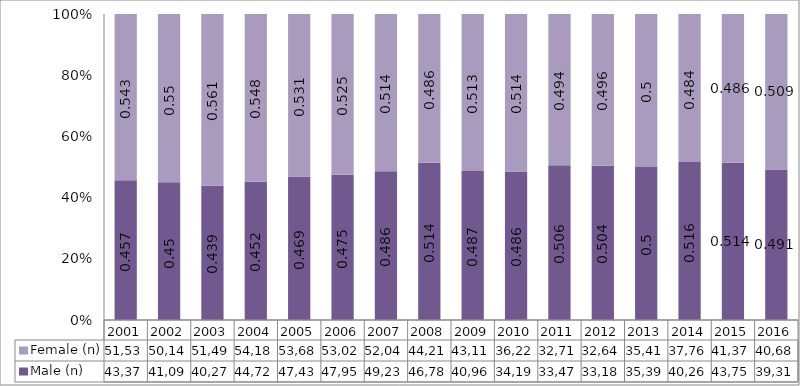
| Category | Male (n) | Female (n) |
|---|---|---|
| 2001.0 | 43374 | 51532 |
| 2002.0 | 41094 | 50146 |
| 2003.0 | 40274 | 51493 |
| 2004.0 | 44726 | 54185 |
| 2005.0 | 47438 | 53688 |
| 2006.0 | 47952 | 53025 |
| 2007.0 | 49232 | 52049 |
| 2008.0 | 46784 | 44218 |
| 2009.0 | 40960 | 43113 |
| 2010.0 | 34196 | 36223 |
| 2011.0 | 33471 | 32713 |
| 2012.0 | 33186 | 32645 |
| 2013.0 | 35390 | 35416 |
| 2014.0 | 40267 | 37762 |
| 2015.0 | 43757 | 41370 |
| 2016.0 | 39313 | 40682 |